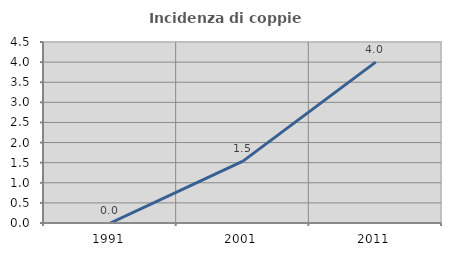
| Category | Incidenza di coppie miste |
|---|---|
| 1991.0 | 0 |
| 2001.0 | 1.538 |
| 2011.0 | 4 |